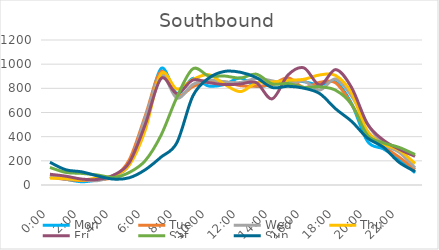
| Category | Mon | Tue | Wed | Thu | Fri | Sat | Sun |
|---|---|---|---|---|---|---|---|
| 0.0 | 71 | 65 | 72 | 57 | 89 | 145 | 188 |
| 0.041667 | 48 | 46 | 49 | 53 | 73 | 104 | 126 |
| 0.083333 | 27 | 37 | 45 | 41 | 49 | 96 | 109 |
| 0.125 | 42 | 45 | 36 | 59 | 46 | 83 | 75 |
| 0.166667 | 73 | 67 | 80 | 77 | 81 | 63 | 49 |
| 0.208333 | 192 | 209 | 170 | 165 | 186 | 104 | 60 |
| 0.25 | 527 | 571 | 554 | 452 | 500 | 201 | 126 |
| 0.291667 | 964 | 938 | 907 | 921 | 881 | 412 | 231 |
| 0.333333 | 757 | 739 | 719 | 794 | 757 | 727 | 351 |
| 0.375 | 882 | 814 | 832 | 873 | 869 | 961 | 736 |
| 0.416667 | 819 | 858 | 869 | 913 | 847 | 903 | 884 |
| 0.458333 | 832 | 854 | 854 | 833 | 831 | 902 | 940 |
| 0.5 | 885 | 822 | 848 | 773 | 836 | 885 | 933 |
| 0.541667 | 816 | 817 | 881 | 845 | 847 | 917 | 889 |
| 0.5833333333333334 | 833 | 832 | 862 | 852 | 713 | 837 | 807 |
| 0.625 | 860 | 887 | 835 | 866 | 911 | 840 | 817 |
| 0.666667 | 855 | 807 | 859 | 875 | 969 | 808 | 801 |
| 0.708333 | 828 | 850 | 786 | 911 | 827 | 812 | 756 |
| 0.75 | 853 | 845 | 878 | 906 | 955 | 784 | 630 |
| 0.791667 | 674 | 668 | 736 | 761 | 807 | 666 | 527 |
| 0.833333 | 362 | 443 | 505 | 444 | 506 | 413 | 389 |
| 0.875 | 299 | 322 | 338 | 339 | 372 | 349 | 313 |
| 0.916667 | 215 | 230 | 271 | 288 | 296 | 311 | 187 |
| 0.958333 | 101 | 128 | 143 | 178 | 237 | 252 | 112 |